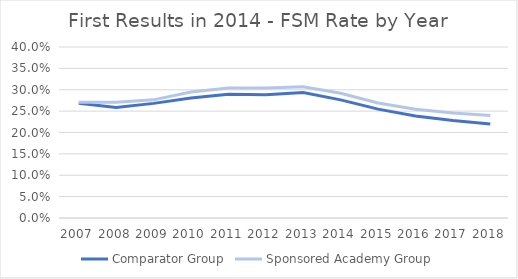
| Category | Comparator Group | Sponsored Academy Group |
|---|---|---|
| 2007.0 | 0.268 | 0.271 |
| 2008.0 | 0.258 | 0.271 |
| 2009.0 | 0.268 | 0.276 |
| 2010.0 | 0.28 | 0.295 |
| 2011.0 | 0.289 | 0.304 |
| 2012.0 | 0.288 | 0.304 |
| 2013.0 | 0.293 | 0.307 |
| 2014.0 | 0.276 | 0.292 |
| 2015.0 | 0.255 | 0.269 |
| 2016.0 | 0.239 | 0.254 |
| 2017.0 | 0.228 | 0.246 |
| 2018.0 | 0.22 | 0.24 |